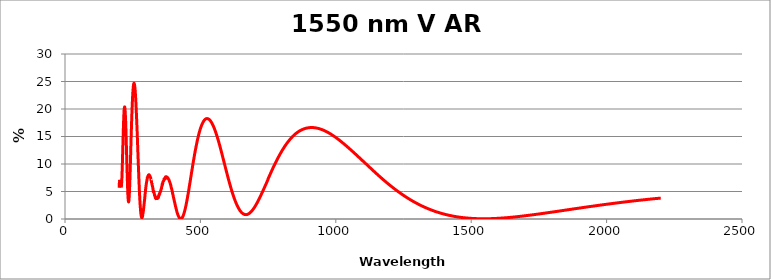
| Category | % Reflectance |
|---|---|
| 200.0 | 5.676 |
| 201.0 | 6.753 |
| 202.0 | 7.115 |
| 203.0 | 6.71 |
| 204.0 | 6.542 |
| 205.0 | 6.526 |
| 206.0 | 5.834 |
| 207.0 | 5.745 |
| 208.0 | 5.913 |
| 209.0 | 6.395 |
| 210.0 | 7.362 |
| 211.0 | 8.712 |
| 212.0 | 10.312 |
| 213.0 | 12.135 |
| 214.0 | 13.895 |
| 215.0 | 15.615 |
| 216.0 | 17.193 |
| 217.0 | 18.494 |
| 218.0 | 19.575 |
| 219.0 | 20.113 |
| 220.0 | 20.384 |
| 221.0 | 20.204 |
| 222.0 | 19.676 |
| 223.0 | 18.834 |
| 224.0 | 17.655 |
| 225.0 | 16.194 |
| 226.0 | 14.555 |
| 227.0 | 12.742 |
| 228.0 | 10.899 |
| 229.0 | 9.098 |
| 230.0 | 7.41 |
| 231.0 | 5.883 |
| 232.0 | 4.609 |
| 233.0 | 3.763 |
| 234.0 | 3.241 |
| 235.0 | 3.112 |
| 236.0 | 3.368 |
| 237.0 | 4.009 |
| 238.0 | 4.991 |
| 239.0 | 6.236 |
| 240.0 | 7.703 |
| 241.0 | 9.345 |
| 242.0 | 11.028 |
| 243.0 | 12.783 |
| 244.0 | 14.509 |
| 245.0 | 16.152 |
| 246.0 | 17.725 |
| 247.0 | 19.185 |
| 248.0 | 20.451 |
| 249.0 | 21.565 |
| 250.0 | 22.553 |
| 251.0 | 23.332 |
| 252.0 | 23.91 |
| 253.0 | 24.365 |
| 254.0 | 24.629 |
| 255.0 | 24.674 |
| 256.0 | 24.578 |
| 257.0 | 24.333 |
| 258.0 | 23.943 |
| 259.0 | 23.426 |
| 260.0 | 22.713 |
| 261.0 | 21.888 |
| 262.0 | 20.976 |
| 263.0 | 19.897 |
| 264.0 | 18.816 |
| 265.0 | 17.603 |
| 266.0 | 16.391 |
| 267.0 | 15.101 |
| 268.0 | 13.752 |
| 269.0 | 12.284 |
| 270.0 | 11 |
| 271.0 | 9.644 |
| 272.0 | 8.347 |
| 273.0 | 7.091 |
| 274.0 | 5.954 |
| 275.0 | 4.825 |
| 276.0 | 3.832 |
| 277.0 | 2.895 |
| 278.0 | 2.263 |
| 279.0 | 1.572 |
| 280.0 | 1.044 |
| 281.0 | 0.694 |
| 282.0 | 0.43 |
| 283.0 | 0.277 |
| 284.0 | 0.195 |
| 285.0 | 0.328 |
| 286.0 | 0.42 |
| 287.0 | 0.695 |
| 288.0 | 1.063 |
| 289.0 | 1.324 |
| 290.0 | 1.776 |
| 291.0 | 2.192 |
| 292.0 | 2.671 |
| 293.0 | 3.147 |
| 294.0 | 3.573 |
| 295.0 | 4.1 |
| 296.0 | 4.615 |
| 297.0 | 5.037 |
| 298.0 | 5.563 |
| 299.0 | 5.943 |
| 300.0 | 6.299 |
| 301.0 | 6.642 |
| 302.0 | 6.872 |
| 303.0 | 7.147 |
| 304.0 | 7.518 |
| 305.0 | 7.549 |
| 306.0 | 7.789 |
| 307.0 | 7.842 |
| 308.0 | 7.986 |
| 309.0 | 7.941 |
| 310.0 | 8.055 |
| 311.0 | 7.874 |
| 312.0 | 7.893 |
| 313.0 | 7.902 |
| 314.0 | 7.742 |
| 315.0 | 7.632 |
| 316.0 | 7.574 |
| 317.0 | 7.265 |
| 318.0 | 7.008 |
| 319.0 | 7.025 |
| 320.0 | 6.449 |
| 321.0 | 6.533 |
| 322.0 | 5.986 |
| 323.0 | 6.071 |
| 324.0 | 5.704 |
| 325.0 | 5.468 |
| 326.0 | 4.962 |
| 327.0 | 4.935 |
| 328.0 | 5.027 |
| 329.0 | 4.765 |
| 330.0 | 4.542 |
| 331.0 | 4.237 |
| 332.0 | 4.293 |
| 333.0 | 4.02 |
| 334.0 | 3.802 |
| 335.0 | 4.135 |
| 336.0 | 3.77 |
| 337.0 | 3.711 |
| 338.0 | 3.468 |
| 339.0 | 3.822 |
| 340.0 | 3.546 |
| 341.0 | 3.833 |
| 342.0 | 3.806 |
| 343.0 | 3.897 |
| 344.0 | 4.062 |
| 345.0 | 3.886 |
| 346.0 | 4.133 |
| 347.0 | 4.439 |
| 348.0 | 4.347 |
| 349.0 | 4.648 |
| 350.0 | 4.569 |
| 351.0 | 4.905 |
| 352.0 | 4.909 |
| 353.0 | 5.017 |
| 354.0 | 5.23 |
| 355.0 | 5.469 |
| 356.0 | 5.523 |
| 357.0 | 5.825 |
| 358.0 | 5.994 |
| 359.0 | 6.367 |
| 360.0 | 6.212 |
| 361.0 | 6.581 |
| 362.0 | 6.802 |
| 363.0 | 6.823 |
| 364.0 | 6.926 |
| 365.0 | 6.984 |
| 366.0 | 7.306 |
| 367.0 | 7.336 |
| 368.0 | 7.3 |
| 369.0 | 7.331 |
| 370.0 | 7.316 |
| 371.0 | 7.649 |
| 372.0 | 7.643 |
| 373.0 | 7.565 |
| 374.0 | 7.613 |
| 375.0 | 7.675 |
| 376.0 | 7.637 |
| 377.0 | 7.604 |
| 378.0 | 7.531 |
| 379.0 | 7.501 |
| 380.0 | 7.461 |
| 381.0 | 7.325 |
| 382.0 | 7.245 |
| 383.0 | 7.181 |
| 384.0 | 7.119 |
| 385.0 | 6.939 |
| 386.0 | 6.849 |
| 387.0 | 6.665 |
| 388.0 | 6.566 |
| 389.0 | 6.377 |
| 390.0 | 6.217 |
| 391.0 | 6.05 |
| 392.0 | 5.773 |
| 393.0 | 5.63 |
| 394.0 | 5.442 |
| 395.0 | 5.223 |
| 396.0 | 5.035 |
| 397.0 | 4.741 |
| 398.0 | 4.533 |
| 399.0 | 4.365 |
| 400.0 | 4.08 |
| 401.0 | 3.856 |
| 402.0 | 3.656 |
| 403.0 | 3.444 |
| 404.0 | 3.193 |
| 405.0 | 3.001 |
| 406.0 | 2.766 |
| 407.0 | 2.562 |
| 408.0 | 2.321 |
| 409.0 | 2.164 |
| 410.0 | 1.912 |
| 411.0 | 1.752 |
| 412.0 | 1.573 |
| 413.0 | 1.372 |
| 414.0 | 1.192 |
| 415.0 | 1.029 |
| 416.0 | 0.892 |
| 417.0 | 0.754 |
| 418.0 | 0.639 |
| 419.0 | 0.514 |
| 420.0 | 0.422 |
| 421.0 | 0.313 |
| 422.0 | 0.251 |
| 423.0 | 0.166 |
| 424.0 | 0.126 |
| 425.0 | 0.091 |
| 426.0 | 0.044 |
| 427.0 | 0.031 |
| 428.0 | 0.03 |
| 429.0 | 0.042 |
| 430.0 | 0.094 |
| 431.0 | 0.119 |
| 432.0 | 0.172 |
| 433.0 | 0.247 |
| 434.0 | 0.336 |
| 435.0 | 0.447 |
| 436.0 | 0.537 |
| 437.0 | 0.681 |
| 438.0 | 0.816 |
| 439.0 | 0.953 |
| 440.0 | 1.132 |
| 441.0 | 1.293 |
| 442.0 | 1.475 |
| 443.0 | 1.681 |
| 444.0 | 1.86 |
| 445.0 | 2.089 |
| 446.0 | 2.319 |
| 447.0 | 2.534 |
| 448.0 | 2.794 |
| 449.0 | 3.045 |
| 450.0 | 3.305 |
| 451.0 | 3.564 |
| 452.0 | 3.839 |
| 453.0 | 4.119 |
| 454.0 | 4.389 |
| 455.0 | 4.68 |
| 456.0 | 4.963 |
| 457.0 | 5.251 |
| 458.0 | 5.571 |
| 459.0 | 5.87 |
| 460.0 | 6.175 |
| 461.0 | 6.466 |
| 462.0 | 6.787 |
| 463.0 | 7.077 |
| 464.0 | 7.398 |
| 465.0 | 7.702 |
| 466.0 | 8.012 |
| 467.0 | 8.326 |
| 468.0 | 8.635 |
| 469.0 | 8.938 |
| 470.0 | 9.247 |
| 471.0 | 9.553 |
| 472.0 | 9.858 |
| 473.0 | 10.148 |
| 474.0 | 10.443 |
| 475.0 | 10.735 |
| 476.0 | 11.018 |
| 477.0 | 11.316 |
| 478.0 | 11.596 |
| 479.0 | 11.865 |
| 480.0 | 12.138 |
| 481.0 | 12.4 |
| 482.0 | 12.665 |
| 483.0 | 12.917 |
| 484.0 | 13.174 |
| 485.0 | 13.413 |
| 486.0 | 13.656 |
| 487.0 | 13.907 |
| 488.0 | 14.136 |
| 489.0 | 14.351 |
| 490.0 | 14.57 |
| 491.0 | 14.781 |
| 492.0 | 14.988 |
| 493.0 | 15.191 |
| 494.0 | 15.391 |
| 495.0 | 15.581 |
| 496.0 | 15.755 |
| 497.0 | 15.929 |
| 498.0 | 16.098 |
| 499.0 | 16.261 |
| 500.0 | 16.413 |
| 501.0 | 16.566 |
| 502.0 | 16.708 |
| 503.0 | 16.842 |
| 504.0 | 16.977 |
| 505.0 | 17.1 |
| 506.0 | 17.215 |
| 507.0 | 17.325 |
| 508.0 | 17.435 |
| 509.0 | 17.528 |
| 510.0 | 17.619 |
| 511.0 | 17.706 |
| 512.0 | 17.789 |
| 513.0 | 17.856 |
| 514.0 | 17.922 |
| 515.0 | 17.982 |
| 516.0 | 18.043 |
| 517.0 | 18.083 |
| 518.0 | 18.132 |
| 519.0 | 18.167 |
| 520.0 | 18.198 |
| 521.0 | 18.224 |
| 522.0 | 18.237 |
| 523.0 | 18.25 |
| 524.0 | 18.256 |
| 525.0 | 18.26 |
| 526.0 | 18.249 |
| 527.0 | 18.237 |
| 528.0 | 18.225 |
| 529.0 | 18.206 |
| 530.0 | 18.178 |
| 531.0 | 18.147 |
| 532.0 | 18.113 |
| 533.0 | 18.066 |
| 534.0 | 18.022 |
| 535.0 | 17.963 |
| 536.0 | 17.914 |
| 537.0 | 17.853 |
| 538.0 | 17.779 |
| 539.0 | 17.711 |
| 540.0 | 17.629 |
| 541.0 | 17.554 |
| 542.0 | 17.472 |
| 543.0 | 17.377 |
| 544.0 | 17.288 |
| 545.0 | 17.193 |
| 546.0 | 17.089 |
| 547.0 | 16.986 |
| 548.0 | 16.872 |
| 549.0 | 16.755 |
| 550.0 | 16.636 |
| 551.0 | 16.517 |
| 552.0 | 16.391 |
| 553.0 | 16.257 |
| 554.0 | 16.123 |
| 555.0 | 15.992 |
| 556.0 | 15.853 |
| 557.0 | 15.716 |
| 558.0 | 15.567 |
| 559.0 | 15.413 |
| 560.0 | 15.263 |
| 561.0 | 15.109 |
| 562.0 | 14.952 |
| 563.0 | 14.795 |
| 564.0 | 14.635 |
| 565.0 | 14.471 |
| 566.0 | 14.299 |
| 567.0 | 14.134 |
| 568.0 | 13.955 |
| 569.0 | 13.783 |
| 570.0 | 13.605 |
| 571.0 | 13.427 |
| 572.0 | 13.245 |
| 573.0 | 13.064 |
| 574.0 | 12.88 |
| 575.0 | 12.693 |
| 576.0 | 12.508 |
| 577.0 | 12.319 |
| 578.0 | 12.129 |
| 579.0 | 11.943 |
| 580.0 | 11.751 |
| 581.0 | 11.558 |
| 582.0 | 11.366 |
| 583.0 | 11.171 |
| 584.0 | 10.977 |
| 585.0 | 10.785 |
| 586.0 | 10.593 |
| 587.0 | 10.396 |
| 588.0 | 10.201 |
| 589.0 | 10.014 |
| 590.0 | 9.819 |
| 591.0 | 9.621 |
| 592.0 | 9.43 |
| 593.0 | 9.239 |
| 594.0 | 9.045 |
| 595.0 | 8.856 |
| 596.0 | 8.664 |
| 597.0 | 8.478 |
| 598.0 | 8.286 |
| 599.0 | 8.096 |
| 600.0 | 7.91 |
| 601.0 | 7.72 |
| 602.0 | 7.537 |
| 603.0 | 7.353 |
| 604.0 | 7.168 |
| 605.0 | 6.985 |
| 606.0 | 6.804 |
| 607.0 | 6.63 |
| 608.0 | 6.453 |
| 609.0 | 6.279 |
| 610.0 | 6.103 |
| 611.0 | 5.936 |
| 612.0 | 5.763 |
| 613.0 | 5.596 |
| 614.0 | 5.432 |
| 615.0 | 5.268 |
| 616.0 | 5.108 |
| 617.0 | 4.949 |
| 618.0 | 4.79 |
| 619.0 | 4.636 |
| 620.0 | 4.485 |
| 621.0 | 4.332 |
| 622.0 | 4.187 |
| 623.0 | 4.045 |
| 624.0 | 3.904 |
| 625.0 | 3.765 |
| 626.0 | 3.625 |
| 627.0 | 3.493 |
| 628.0 | 3.365 |
| 629.0 | 3.238 |
| 630.0 | 3.113 |
| 631.0 | 2.992 |
| 632.0 | 2.874 |
| 633.0 | 2.759 |
| 634.0 | 2.648 |
| 635.0 | 2.54 |
| 636.0 | 2.434 |
| 637.0 | 2.331 |
| 638.0 | 2.231 |
| 639.0 | 2.134 |
| 640.0 | 2.043 |
| 641.0 | 1.954 |
| 642.0 | 1.866 |
| 643.0 | 1.784 |
| 644.0 | 1.705 |
| 645.0 | 1.628 |
| 646.0 | 1.555 |
| 647.0 | 1.487 |
| 648.0 | 1.418 |
| 649.0 | 1.359 |
| 650.0 | 1.296 |
| 651.0 | 1.243 |
| 652.0 | 1.188 |
| 653.0 | 1.14 |
| 654.0 | 1.095 |
| 655.0 | 1.053 |
| 656.0 | 1.014 |
| 657.0 | 0.975 |
| 658.0 | 0.945 |
| 659.0 | 0.915 |
| 660.0 | 0.888 |
| 661.0 | 0.866 |
| 662.0 | 0.846 |
| 663.0 | 0.829 |
| 664.0 | 0.817 |
| 665.0 | 0.806 |
| 666.0 | 0.8 |
| 667.0 | 0.795 |
| 668.0 | 0.795 |
| 669.0 | 0.793 |
| 670.0 | 0.8 |
| 671.0 | 0.809 |
| 672.0 | 0.819 |
| 673.0 | 0.83 |
| 674.0 | 0.849 |
| 675.0 | 0.869 |
| 676.0 | 0.892 |
| 677.0 | 0.915 |
| 678.0 | 0.941 |
| 679.0 | 0.971 |
| 680.0 | 1.004 |
| 681.0 | 1.042 |
| 682.0 | 1.078 |
| 683.0 | 1.117 |
| 684.0 | 1.162 |
| 685.0 | 1.209 |
| 686.0 | 1.257 |
| 687.0 | 1.308 |
| 688.0 | 1.362 |
| 689.0 | 1.417 |
| 690.0 | 1.47 |
| 691.0 | 1.528 |
| 692.0 | 1.591 |
| 693.0 | 1.654 |
| 694.0 | 1.718 |
| 695.0 | 1.784 |
| 696.0 | 1.855 |
| 697.0 | 1.923 |
| 698.0 | 1.999 |
| 699.0 | 2.07 |
| 700.0 | 2.147 |
| 701.0 | 2.228 |
| 702.0 | 2.306 |
| 703.0 | 2.387 |
| 704.0 | 2.469 |
| 705.0 | 2.554 |
| 706.0 | 2.641 |
| 707.0 | 2.729 |
| 708.0 | 2.815 |
| 709.0 | 2.905 |
| 710.0 | 2.995 |
| 711.0 | 3.088 |
| 712.0 | 3.182 |
| 713.0 | 3.279 |
| 714.0 | 3.373 |
| 715.0 | 3.47 |
| 716.0 | 3.566 |
| 717.0 | 3.664 |
| 718.0 | 3.764 |
| 719.0 | 3.867 |
| 720.0 | 3.965 |
| 721.0 | 4.063 |
| 722.0 | 4.167 |
| 723.0 | 4.27 |
| 724.0 | 4.377 |
| 725.0 | 4.484 |
| 726.0 | 4.59 |
| 727.0 | 4.699 |
| 728.0 | 4.801 |
| 729.0 | 4.914 |
| 730.0 | 5.015 |
| 731.0 | 5.126 |
| 732.0 | 5.237 |
| 733.0 | 5.342 |
| 734.0 | 5.451 |
| 735.0 | 5.561 |
| 736.0 | 5.67 |
| 737.0 | 5.784 |
| 738.0 | 5.89 |
| 739.0 | 6.003 |
| 740.0 | 6.113 |
| 741.0 | 6.222 |
| 742.0 | 6.329 |
| 743.0 | 6.436 |
| 744.0 | 6.555 |
| 745.0 | 6.663 |
| 746.0 | 6.774 |
| 747.0 | 6.884 |
| 748.0 | 6.993 |
| 749.0 | 7.114 |
| 750.0 | 7.291 |
| 751.0 | 7.405 |
| 752.0 | 7.516 |
| 753.0 | 7.63 |
| 754.0 | 7.738 |
| 755.0 | 7.854 |
| 756.0 | 7.96 |
| 757.0 | 8.075 |
| 758.0 | 8.181 |
| 759.0 | 8.293 |
| 760.0 | 8.401 |
| 761.0 | 8.51 |
| 762.0 | 8.625 |
| 763.0 | 8.729 |
| 764.0 | 8.839 |
| 765.0 | 8.95 |
| 766.0 | 9.055 |
| 767.0 | 9.155 |
| 768.0 | 9.27 |
| 769.0 | 9.372 |
| 770.0 | 9.474 |
| 771.0 | 9.577 |
| 772.0 | 9.679 |
| 773.0 | 9.779 |
| 774.0 | 9.884 |
| 775.0 | 9.987 |
| 776.0 | 10.082 |
| 777.0 | 10.185 |
| 778.0 | 10.282 |
| 779.0 | 10.38 |
| 780.0 | 10.479 |
| 781.0 | 10.58 |
| 782.0 | 10.676 |
| 783.0 | 10.77 |
| 784.0 | 10.872 |
| 785.0 | 10.956 |
| 786.0 | 11.053 |
| 787.0 | 11.151 |
| 788.0 | 11.243 |
| 789.0 | 11.33 |
| 790.0 | 11.426 |
| 791.0 | 11.513 |
| 792.0 | 11.601 |
| 793.0 | 11.697 |
| 794.0 | 11.786 |
| 795.0 | 11.875 |
| 796.0 | 11.957 |
| 797.0 | 12.044 |
| 798.0 | 12.128 |
| 799.0 | 12.215 |
| 800.0 | 12.303 |
| 801.0 | 12.383 |
| 802.0 | 12.467 |
| 803.0 | 12.547 |
| 804.0 | 12.624 |
| 805.0 | 12.706 |
| 806.0 | 12.787 |
| 807.0 | 12.864 |
| 808.0 | 12.936 |
| 809.0 | 13.017 |
| 810.0 | 13.091 |
| 811.0 | 13.164 |
| 812.0 | 13.247 |
| 813.0 | 13.311 |
| 814.0 | 13.388 |
| 815.0 | 13.457 |
| 816.0 | 13.528 |
| 817.0 | 13.596 |
| 818.0 | 13.671 |
| 819.0 | 13.735 |
| 820.0 | 13.798 |
| 821.0 | 13.866 |
| 822.0 | 13.932 |
| 823.0 | 13.996 |
| 824.0 | 14.06 |
| 825.0 | 14.125 |
| 826.0 | 14.186 |
| 827.0 | 14.249 |
| 828.0 | 14.311 |
| 829.0 | 14.366 |
| 830.0 | 14.424 |
| 831.0 | 14.49 |
| 832.0 | 14.544 |
| 833.0 | 14.604 |
| 834.0 | 14.655 |
| 835.0 | 14.708 |
| 836.0 | 14.765 |
| 837.0 | 14.817 |
| 838.0 | 14.872 |
| 839.0 | 14.919 |
| 840.0 | 14.972 |
| 841.0 | 15.022 |
| 842.0 | 15.071 |
| 843.0 | 15.119 |
| 844.0 | 15.168 |
| 845.0 | 15.212 |
| 846.0 | 15.26 |
| 847.0 | 15.306 |
| 848.0 | 15.35 |
| 849.0 | 15.394 |
| 850.0 | 15.436 |
| 851.0 | 15.479 |
| 852.0 | 15.518 |
| 853.0 | 15.56 |
| 854.0 | 15.597 |
| 855.0 | 15.634 |
| 856.0 | 15.671 |
| 857.0 | 15.705 |
| 858.0 | 15.741 |
| 859.0 | 15.776 |
| 860.0 | 15.812 |
| 861.0 | 15.845 |
| 862.0 | 15.878 |
| 863.0 | 15.908 |
| 864.0 | 15.941 |
| 865.0 | 15.969 |
| 866.0 | 16.002 |
| 867.0 | 16.029 |
| 868.0 | 16.058 |
| 869.0 | 16.085 |
| 870.0 | 16.111 |
| 871.0 | 16.141 |
| 872.0 | 16.163 |
| 873.0 | 16.191 |
| 874.0 | 16.214 |
| 875.0 | 16.235 |
| 876.0 | 16.259 |
| 877.0 | 16.28 |
| 878.0 | 16.301 |
| 879.0 | 16.322 |
| 880.0 | 16.342 |
| 881.0 | 16.36 |
| 882.0 | 16.381 |
| 883.0 | 16.395 |
| 884.0 | 16.413 |
| 885.0 | 16.43 |
| 886.0 | 16.445 |
| 887.0 | 16.458 |
| 888.0 | 16.474 |
| 889.0 | 16.486 |
| 890.0 | 16.499 |
| 891.0 | 16.514 |
| 892.0 | 16.522 |
| 893.0 | 16.538 |
| 894.0 | 16.546 |
| 895.0 | 16.555 |
| 896.0 | 16.564 |
| 897.0 | 16.572 |
| 898.0 | 16.583 |
| 899.0 | 16.588 |
| 900.0 | 16.595 |
| 901.0 | 16.602 |
| 902.0 | 16.608 |
| 903.0 | 16.612 |
| 904.0 | 16.615 |
| 905.0 | 16.619 |
| 906.0 | 16.621 |
| 907.0 | 16.623 |
| 908.0 | 16.628 |
| 909.0 | 16.626 |
| 910.0 | 16.63 |
| 911.0 | 16.626 |
| 912.0 | 16.63 |
| 913.0 | 16.626 |
| 914.0 | 16.626 |
| 915.0 | 16.627 |
| 916.0 | 16.617 |
| 917.0 | 16.619 |
| 918.0 | 16.615 |
| 919.0 | 16.609 |
| 920.0 | 16.604 |
| 921.0 | 16.602 |
| 922.0 | 16.592 |
| 923.0 | 16.588 |
| 924.0 | 16.58 |
| 925.0 | 16.574 |
| 926.0 | 16.567 |
| 927.0 | 16.556 |
| 928.0 | 16.548 |
| 929.0 | 16.538 |
| 930.0 | 16.527 |
| 931.0 | 16.517 |
| 932.0 | 16.506 |
| 933.0 | 16.494 |
| 934.0 | 16.482 |
| 935.0 | 16.471 |
| 936.0 | 16.458 |
| 937.0 | 16.444 |
| 938.0 | 16.43 |
| 939.0 | 16.415 |
| 940.0 | 16.401 |
| 941.0 | 16.387 |
| 942.0 | 16.368 |
| 943.0 | 16.354 |
| 944.0 | 16.34 |
| 945.0 | 16.321 |
| 946.0 | 16.305 |
| 947.0 | 16.287 |
| 948.0 | 16.27 |
| 949.0 | 16.251 |
| 950.0 | 16.231 |
| 951.0 | 16.212 |
| 952.0 | 16.194 |
| 953.0 | 16.172 |
| 954.0 | 16.151 |
| 955.0 | 16.132 |
| 956.0 | 16.109 |
| 957.0 | 16.085 |
| 958.0 | 16.063 |
| 959.0 | 16.042 |
| 960.0 | 16.017 |
| 961.0 | 15.993 |
| 962.0 | 15.97 |
| 963.0 | 15.949 |
| 964.0 | 15.922 |
| 965.0 | 15.897 |
| 966.0 | 15.872 |
| 967.0 | 15.847 |
| 968.0 | 15.818 |
| 969.0 | 15.796 |
| 970.0 | 15.767 |
| 971.0 | 15.738 |
| 972.0 | 15.713 |
| 973.0 | 15.684 |
| 974.0 | 15.658 |
| 975.0 | 15.631 |
| 976.0 | 15.602 |
| 977.0 | 15.569 |
| 978.0 | 15.542 |
| 979.0 | 15.513 |
| 980.0 | 15.482 |
| 981.0 | 15.452 |
| 982.0 | 15.423 |
| 983.0 | 15.391 |
| 984.0 | 15.359 |
| 985.0 | 15.33 |
| 986.0 | 15.298 |
| 987.0 | 15.264 |
| 988.0 | 15.235 |
| 989.0 | 15.198 |
| 990.0 | 15.166 |
| 991.0 | 15.136 |
| 992.0 | 15.1 |
| 993.0 | 15.067 |
| 994.0 | 15.033 |
| 995.0 | 15 |
| 996.0 | 14.964 |
| 997.0 | 14.929 |
| 998.0 | 14.894 |
| 999.0 | 14.859 |
| 1000.0 | 14.825 |
| 1001.0 | 14.786 |
| 1002.0 | 14.751 |
| 1003.0 | 14.712 |
| 1004.0 | 14.676 |
| 1005.0 | 14.642 |
| 1006.0 | 14.603 |
| 1007.0 | 14.568 |
| 1008.0 | 14.527 |
| 1009.0 | 14.488 |
| 1010.0 | 14.453 |
| 1011.0 | 14.415 |
| 1012.0 | 14.378 |
| 1013.0 | 14.338 |
| 1014.0 | 14.301 |
| 1015.0 | 14.258 |
| 1016.0 | 14.221 |
| 1017.0 | 14.182 |
| 1018.0 | 14.141 |
| 1019.0 | 14.103 |
| 1020.0 | 14.065 |
| 1021.0 | 14.022 |
| 1022.0 | 13.982 |
| 1023.0 | 13.941 |
| 1024.0 | 13.901 |
| 1025.0 | 13.86 |
| 1026.0 | 13.821 |
| 1027.0 | 13.778 |
| 1028.0 | 13.739 |
| 1029.0 | 13.697 |
| 1030.0 | 13.657 |
| 1031.0 | 13.614 |
| 1032.0 | 13.575 |
| 1033.0 | 13.531 |
| 1034.0 | 13.489 |
| 1035.0 | 13.449 |
| 1036.0 | 13.408 |
| 1037.0 | 13.365 |
| 1038.0 | 13.323 |
| 1039.0 | 13.28 |
| 1040.0 | 13.236 |
| 1041.0 | 13.196 |
| 1042.0 | 13.154 |
| 1043.0 | 13.11 |
| 1044.0 | 13.066 |
| 1045.0 | 13.023 |
| 1046.0 | 12.981 |
| 1047.0 | 12.938 |
| 1048.0 | 12.893 |
| 1049.0 | 12.853 |
| 1050.0 | 12.807 |
| 1051.0 | 12.766 |
| 1052.0 | 12.718 |
| 1053.0 | 12.677 |
| 1054.0 | 12.633 |
| 1055.0 | 12.59 |
| 1056.0 | 12.545 |
| 1057.0 | 12.501 |
| 1058.0 | 12.457 |
| 1059.0 | 12.41 |
| 1060.0 | 12.365 |
| 1061.0 | 12.322 |
| 1062.0 | 12.278 |
| 1063.0 | 12.235 |
| 1064.0 | 12.188 |
| 1065.0 | 12.142 |
| 1066.0 | 12.099 |
| 1067.0 | 12.055 |
| 1068.0 | 12.009 |
| 1069.0 | 11.964 |
| 1070.0 | 11.922 |
| 1071.0 | 11.873 |
| 1072.0 | 11.829 |
| 1073.0 | 11.784 |
| 1074.0 | 11.739 |
| 1075.0 | 11.693 |
| 1076.0 | 11.647 |
| 1077.0 | 11.602 |
| 1078.0 | 11.555 |
| 1079.0 | 11.509 |
| 1080.0 | 11.466 |
| 1081.0 | 11.42 |
| 1082.0 | 11.373 |
| 1083.0 | 11.328 |
| 1084.0 | 11.281 |
| 1085.0 | 11.234 |
| 1086.0 | 11.19 |
| 1087.0 | 11.145 |
| 1088.0 | 11.098 |
| 1089.0 | 11.052 |
| 1090.0 | 11.004 |
| 1091.0 | 10.96 |
| 1092.0 | 10.912 |
| 1093.0 | 10.867 |
| 1094.0 | 10.82 |
| 1095.0 | 10.775 |
| 1096.0 | 10.728 |
| 1097.0 | 10.682 |
| 1098.0 | 10.633 |
| 1099.0 | 10.586 |
| 1100.0 | 10.564 |
| 1101.0 | 10.519 |
| 1102.0 | 10.472 |
| 1103.0 | 10.425 |
| 1104.0 | 10.377 |
| 1105.0 | 10.329 |
| 1106.0 | 10.282 |
| 1107.0 | 10.237 |
| 1108.0 | 10.192 |
| 1109.0 | 10.143 |
| 1110.0 | 10.094 |
| 1111.0 | 10.048 |
| 1112.0 | 10.003 |
| 1113.0 | 9.956 |
| 1114.0 | 9.913 |
| 1115.0 | 9.864 |
| 1116.0 | 9.816 |
| 1117.0 | 9.771 |
| 1118.0 | 9.725 |
| 1119.0 | 9.68 |
| 1120.0 | 9.634 |
| 1121.0 | 9.586 |
| 1122.0 | 9.541 |
| 1123.0 | 9.492 |
| 1124.0 | 9.447 |
| 1125.0 | 9.4 |
| 1126.0 | 9.353 |
| 1127.0 | 9.308 |
| 1128.0 | 9.264 |
| 1129.0 | 9.213 |
| 1130.0 | 9.169 |
| 1131.0 | 9.122 |
| 1132.0 | 9.076 |
| 1133.0 | 9.032 |
| 1134.0 | 8.983 |
| 1135.0 | 8.937 |
| 1136.0 | 8.892 |
| 1137.0 | 8.847 |
| 1138.0 | 8.8 |
| 1139.0 | 8.757 |
| 1140.0 | 8.709 |
| 1141.0 | 8.662 |
| 1142.0 | 8.618 |
| 1143.0 | 8.573 |
| 1144.0 | 8.531 |
| 1145.0 | 8.484 |
| 1146.0 | 8.44 |
| 1147.0 | 8.393 |
| 1148.0 | 8.348 |
| 1149.0 | 8.303 |
| 1150.0 | 8.258 |
| 1151.0 | 8.214 |
| 1152.0 | 8.169 |
| 1153.0 | 8.124 |
| 1154.0 | 8.079 |
| 1155.0 | 8.034 |
| 1156.0 | 7.99 |
| 1157.0 | 7.947 |
| 1158.0 | 7.904 |
| 1159.0 | 7.859 |
| 1160.0 | 7.815 |
| 1161.0 | 7.77 |
| 1162.0 | 7.727 |
| 1163.0 | 7.683 |
| 1164.0 | 7.64 |
| 1165.0 | 7.595 |
| 1166.0 | 7.553 |
| 1167.0 | 7.506 |
| 1168.0 | 7.465 |
| 1169.0 | 7.423 |
| 1170.0 | 7.378 |
| 1171.0 | 7.337 |
| 1172.0 | 7.294 |
| 1173.0 | 7.248 |
| 1174.0 | 7.206 |
| 1175.0 | 7.163 |
| 1176.0 | 7.121 |
| 1177.0 | 7.079 |
| 1178.0 | 7.036 |
| 1179.0 | 6.993 |
| 1180.0 | 6.949 |
| 1181.0 | 6.909 |
| 1182.0 | 6.867 |
| 1183.0 | 6.826 |
| 1184.0 | 6.783 |
| 1185.0 | 6.741 |
| 1186.0 | 6.699 |
| 1187.0 | 6.659 |
| 1188.0 | 6.617 |
| 1189.0 | 6.575 |
| 1190.0 | 6.535 |
| 1191.0 | 6.492 |
| 1192.0 | 6.45 |
| 1193.0 | 6.41 |
| 1194.0 | 6.368 |
| 1195.0 | 6.328 |
| 1196.0 | 6.288 |
| 1197.0 | 6.249 |
| 1198.0 | 6.206 |
| 1199.0 | 6.166 |
| 1200.0 | 6.129 |
| 1201.0 | 6.089 |
| 1202.0 | 6.051 |
| 1203.0 | 6.012 |
| 1204.0 | 5.975 |
| 1205.0 | 5.931 |
| 1206.0 | 5.894 |
| 1207.0 | 5.857 |
| 1208.0 | 5.817 |
| 1209.0 | 5.779 |
| 1210.0 | 5.74 |
| 1211.0 | 5.7 |
| 1212.0 | 5.662 |
| 1213.0 | 5.625 |
| 1214.0 | 5.586 |
| 1215.0 | 5.548 |
| 1216.0 | 5.511 |
| 1217.0 | 5.471 |
| 1218.0 | 5.435 |
| 1219.0 | 5.399 |
| 1220.0 | 5.361 |
| 1221.0 | 5.324 |
| 1222.0 | 5.288 |
| 1223.0 | 5.248 |
| 1224.0 | 5.213 |
| 1225.0 | 5.177 |
| 1226.0 | 5.139 |
| 1227.0 | 5.101 |
| 1228.0 | 5.067 |
| 1229.0 | 5.029 |
| 1230.0 | 4.993 |
| 1231.0 | 4.957 |
| 1232.0 | 4.923 |
| 1233.0 | 4.886 |
| 1234.0 | 4.851 |
| 1235.0 | 4.815 |
| 1236.0 | 4.78 |
| 1237.0 | 4.746 |
| 1238.0 | 4.709 |
| 1239.0 | 4.676 |
| 1240.0 | 4.641 |
| 1241.0 | 4.607 |
| 1242.0 | 4.572 |
| 1243.0 | 4.538 |
| 1244.0 | 4.503 |
| 1245.0 | 4.469 |
| 1246.0 | 4.435 |
| 1247.0 | 4.403 |
| 1248.0 | 4.368 |
| 1249.0 | 4.333 |
| 1250.0 | 4.302 |
| 1251.0 | 4.268 |
| 1252.0 | 4.235 |
| 1253.0 | 4.202 |
| 1254.0 | 4.169 |
| 1255.0 | 4.136 |
| 1256.0 | 4.104 |
| 1257.0 | 4.071 |
| 1258.0 | 4.038 |
| 1259.0 | 4.007 |
| 1260.0 | 3.976 |
| 1261.0 | 3.943 |
| 1262.0 | 3.911 |
| 1263.0 | 3.881 |
| 1264.0 | 3.849 |
| 1265.0 | 3.817 |
| 1266.0 | 3.786 |
| 1267.0 | 3.757 |
| 1268.0 | 3.724 |
| 1269.0 | 3.694 |
| 1270.0 | 3.663 |
| 1271.0 | 3.634 |
| 1272.0 | 3.603 |
| 1273.0 | 3.574 |
| 1274.0 | 3.543 |
| 1275.0 | 3.513 |
| 1276.0 | 3.484 |
| 1277.0 | 3.453 |
| 1278.0 | 3.424 |
| 1279.0 | 3.397 |
| 1280.0 | 3.367 |
| 1281.0 | 3.337 |
| 1282.0 | 3.309 |
| 1283.0 | 3.281 |
| 1284.0 | 3.252 |
| 1285.0 | 3.224 |
| 1286.0 | 3.196 |
| 1287.0 | 3.166 |
| 1288.0 | 3.141 |
| 1289.0 | 3.113 |
| 1290.0 | 3.085 |
| 1291.0 | 3.059 |
| 1292.0 | 3.032 |
| 1293.0 | 3.005 |
| 1294.0 | 2.977 |
| 1295.0 | 2.952 |
| 1296.0 | 2.924 |
| 1297.0 | 2.898 |
| 1298.0 | 2.872 |
| 1299.0 | 2.845 |
| 1300.0 | 2.819 |
| 1301.0 | 2.793 |
| 1302.0 | 2.768 |
| 1303.0 | 2.742 |
| 1304.0 | 2.716 |
| 1305.0 | 2.691 |
| 1306.0 | 2.663 |
| 1307.0 | 2.639 |
| 1308.0 | 2.615 |
| 1309.0 | 2.591 |
| 1310.0 | 2.565 |
| 1311.0 | 2.54 |
| 1312.0 | 2.515 |
| 1313.0 | 2.491 |
| 1314.0 | 2.468 |
| 1315.0 | 2.444 |
| 1316.0 | 2.419 |
| 1317.0 | 2.395 |
| 1318.0 | 2.37 |
| 1319.0 | 2.348 |
| 1320.0 | 2.325 |
| 1321.0 | 2.301 |
| 1322.0 | 2.279 |
| 1323.0 | 2.257 |
| 1324.0 | 2.234 |
| 1325.0 | 2.211 |
| 1326.0 | 2.189 |
| 1327.0 | 2.167 |
| 1328.0 | 2.143 |
| 1329.0 | 2.122 |
| 1330.0 | 2.1 |
| 1331.0 | 2.078 |
| 1332.0 | 2.057 |
| 1333.0 | 2.036 |
| 1334.0 | 2.013 |
| 1335.0 | 1.991 |
| 1336.0 | 1.971 |
| 1337.0 | 1.95 |
| 1338.0 | 1.929 |
| 1339.0 | 1.909 |
| 1340.0 | 1.888 |
| 1341.0 | 1.868 |
| 1342.0 | 1.847 |
| 1343.0 | 1.826 |
| 1344.0 | 1.807 |
| 1345.0 | 1.787 |
| 1346.0 | 1.768 |
| 1347.0 | 1.748 |
| 1348.0 | 1.729 |
| 1349.0 | 1.711 |
| 1350.0 | 1.691 |
| 1351.0 | 1.672 |
| 1352.0 | 1.653 |
| 1353.0 | 1.634 |
| 1354.0 | 1.616 |
| 1355.0 | 1.598 |
| 1356.0 | 1.579 |
| 1357.0 | 1.559 |
| 1358.0 | 1.542 |
| 1359.0 | 1.523 |
| 1360.0 | 1.506 |
| 1361.0 | 1.487 |
| 1362.0 | 1.468 |
| 1363.0 | 1.449 |
| 1364.0 | 1.43 |
| 1365.0 | 1.414 |
| 1366.0 | 1.395 |
| 1367.0 | 1.378 |
| 1368.0 | 1.362 |
| 1369.0 | 1.344 |
| 1370.0 | 1.327 |
| 1371.0 | 1.313 |
| 1372.0 | 1.296 |
| 1373.0 | 1.279 |
| 1374.0 | 1.267 |
| 1375.0 | 1.251 |
| 1376.0 | 1.235 |
| 1377.0 | 1.22 |
| 1378.0 | 1.205 |
| 1379.0 | 1.189 |
| 1380.0 | 1.175 |
| 1381.0 | 1.158 |
| 1382.0 | 1.141 |
| 1383.0 | 1.126 |
| 1384.0 | 1.11 |
| 1385.0 | 1.095 |
| 1386.0 | 1.079 |
| 1387.0 | 1.066 |
| 1388.0 | 1.051 |
| 1389.0 | 1.038 |
| 1390.0 | 1.024 |
| 1391.0 | 1.01 |
| 1392.0 | 0.997 |
| 1393.0 | 0.983 |
| 1394.0 | 0.97 |
| 1395.0 | 0.955 |
| 1396.0 | 0.943 |
| 1397.0 | 0.928 |
| 1398.0 | 0.916 |
| 1399.0 | 0.903 |
| 1400.0 | 0.889 |
| 1401.0 | 0.876 |
| 1402.0 | 0.863 |
| 1403.0 | 0.851 |
| 1404.0 | 0.838 |
| 1405.0 | 0.825 |
| 1406.0 | 0.813 |
| 1407.0 | 0.801 |
| 1408.0 | 0.789 |
| 1409.0 | 0.777 |
| 1410.0 | 0.765 |
| 1411.0 | 0.755 |
| 1412.0 | 0.742 |
| 1413.0 | 0.731 |
| 1414.0 | 0.72 |
| 1415.0 | 0.708 |
| 1416.0 | 0.697 |
| 1417.0 | 0.687 |
| 1418.0 | 0.677 |
| 1419.0 | 0.665 |
| 1420.0 | 0.655 |
| 1421.0 | 0.643 |
| 1422.0 | 0.633 |
| 1423.0 | 0.624 |
| 1424.0 | 0.613 |
| 1425.0 | 0.604 |
| 1426.0 | 0.593 |
| 1427.0 | 0.583 |
| 1428.0 | 0.573 |
| 1429.0 | 0.564 |
| 1430.0 | 0.554 |
| 1431.0 | 0.545 |
| 1432.0 | 0.534 |
| 1433.0 | 0.524 |
| 1434.0 | 0.515 |
| 1435.0 | 0.506 |
| 1436.0 | 0.497 |
| 1437.0 | 0.488 |
| 1438.0 | 0.48 |
| 1439.0 | 0.47 |
| 1440.0 | 0.462 |
| 1441.0 | 0.454 |
| 1442.0 | 0.445 |
| 1443.0 | 0.436 |
| 1444.0 | 0.429 |
| 1445.0 | 0.419 |
| 1446.0 | 0.413 |
| 1447.0 | 0.403 |
| 1448.0 | 0.395 |
| 1449.0 | 0.387 |
| 1450.0 | 0.381 |
| 1451.0 | 0.373 |
| 1452.0 | 0.366 |
| 1453.0 | 0.358 |
| 1454.0 | 0.351 |
| 1455.0 | 0.344 |
| 1456.0 | 0.338 |
| 1457.0 | 0.33 |
| 1458.0 | 0.322 |
| 1459.0 | 0.317 |
| 1460.0 | 0.31 |
| 1461.0 | 0.304 |
| 1462.0 | 0.298 |
| 1463.0 | 0.29 |
| 1464.0 | 0.285 |
| 1465.0 | 0.277 |
| 1466.0 | 0.271 |
| 1467.0 | 0.266 |
| 1468.0 | 0.261 |
| 1469.0 | 0.255 |
| 1470.0 | 0.249 |
| 1471.0 | 0.243 |
| 1472.0 | 0.237 |
| 1473.0 | 0.231 |
| 1474.0 | 0.227 |
| 1475.0 | 0.221 |
| 1476.0 | 0.216 |
| 1477.0 | 0.21 |
| 1478.0 | 0.206 |
| 1479.0 | 0.202 |
| 1480.0 | 0.196 |
| 1481.0 | 0.191 |
| 1482.0 | 0.187 |
| 1483.0 | 0.182 |
| 1484.0 | 0.178 |
| 1485.0 | 0.174 |
| 1486.0 | 0.167 |
| 1487.0 | 0.164 |
| 1488.0 | 0.161 |
| 1489.0 | 0.156 |
| 1490.0 | 0.151 |
| 1491.0 | 0.149 |
| 1492.0 | 0.145 |
| 1493.0 | 0.141 |
| 1494.0 | 0.137 |
| 1495.0 | 0.133 |
| 1496.0 | 0.128 |
| 1497.0 | 0.125 |
| 1498.0 | 0.123 |
| 1499.0 | 0.119 |
| 1500.0 | 0.116 |
| 1501.0 | 0.113 |
| 1502.0 | 0.11 |
| 1503.0 | 0.107 |
| 1504.0 | 0.104 |
| 1505.0 | 0.102 |
| 1506.0 | 0.099 |
| 1507.0 | 0.096 |
| 1508.0 | 0.093 |
| 1509.0 | 0.09 |
| 1510.0 | 0.088 |
| 1511.0 | 0.086 |
| 1512.0 | 0.083 |
| 1513.0 | 0.081 |
| 1514.0 | 0.079 |
| 1515.0 | 0.077 |
| 1516.0 | 0.076 |
| 1517.0 | 0.073 |
| 1518.0 | 0.072 |
| 1519.0 | 0.069 |
| 1520.0 | 0.067 |
| 1521.0 | 0.067 |
| 1522.0 | 0.064 |
| 1523.0 | 0.063 |
| 1524.0 | 0.061 |
| 1525.0 | 0.06 |
| 1526.0 | 0.059 |
| 1527.0 | 0.057 |
| 1528.0 | 0.056 |
| 1529.0 | 0.055 |
| 1530.0 | 0.055 |
| 1531.0 | 0.054 |
| 1532.0 | 0.053 |
| 1533.0 | 0.051 |
| 1534.0 | 0.051 |
| 1535.0 | 0.05 |
| 1536.0 | 0.049 |
| 1537.0 | 0.049 |
| 1538.0 | 0.049 |
| 1539.0 | 0.048 |
| 1540.0 | 0.048 |
| 1541.0 | 0.047 |
| 1542.0 | 0.048 |
| 1543.0 | 0.046 |
| 1544.0 | 0.046 |
| 1545.0 | 0.046 |
| 1546.0 | 0.048 |
| 1547.0 | 0.046 |
| 1548.0 | 0.047 |
| 1549.0 | 0.047 |
| 1550.0 | 0.047 |
| 1551.0 | 0.048 |
| 1552.0 | 0.048 |
| 1553.0 | 0.048 |
| 1554.0 | 0.048 |
| 1555.0 | 0.048 |
| 1556.0 | 0.05 |
| 1557.0 | 0.049 |
| 1558.0 | 0.051 |
| 1559.0 | 0.052 |
| 1560.0 | 0.053 |
| 1561.0 | 0.054 |
| 1562.0 | 0.055 |
| 1563.0 | 0.056 |
| 1564.0 | 0.057 |
| 1565.0 | 0.058 |
| 1566.0 | 0.06 |
| 1567.0 | 0.059 |
| 1568.0 | 0.061 |
| 1569.0 | 0.062 |
| 1570.0 | 0.063 |
| 1571.0 | 0.065 |
| 1572.0 | 0.067 |
| 1573.0 | 0.068 |
| 1574.0 | 0.068 |
| 1575.0 | 0.072 |
| 1576.0 | 0.073 |
| 1577.0 | 0.075 |
| 1578.0 | 0.077 |
| 1579.0 | 0.077 |
| 1580.0 | 0.081 |
| 1581.0 | 0.082 |
| 1582.0 | 0.085 |
| 1583.0 | 0.086 |
| 1584.0 | 0.089 |
| 1585.0 | 0.091 |
| 1586.0 | 0.092 |
| 1587.0 | 0.095 |
| 1588.0 | 0.097 |
| 1589.0 | 0.099 |
| 1590.0 | 0.102 |
| 1591.0 | 0.105 |
| 1592.0 | 0.107 |
| 1593.0 | 0.109 |
| 1594.0 | 0.112 |
| 1595.0 | 0.114 |
| 1596.0 | 0.117 |
| 1597.0 | 0.119 |
| 1598.0 | 0.123 |
| 1599.0 | 0.125 |
| 1600.0 | 0.129 |
| 1601.0 | 0.131 |
| 1602.0 | 0.135 |
| 1603.0 | 0.137 |
| 1604.0 | 0.139 |
| 1605.0 | 0.143 |
| 1606.0 | 0.147 |
| 1607.0 | 0.149 |
| 1608.0 | 0.152 |
| 1609.0 | 0.157 |
| 1610.0 | 0.16 |
| 1611.0 | 0.162 |
| 1612.0 | 0.166 |
| 1613.0 | 0.169 |
| 1614.0 | 0.173 |
| 1615.0 | 0.176 |
| 1616.0 | 0.18 |
| 1617.0 | 0.183 |
| 1618.0 | 0.187 |
| 1619.0 | 0.191 |
| 1620.0 | 0.195 |
| 1621.0 | 0.198 |
| 1622.0 | 0.202 |
| 1623.0 | 0.206 |
| 1624.0 | 0.21 |
| 1625.0 | 0.213 |
| 1626.0 | 0.218 |
| 1627.0 | 0.221 |
| 1628.0 | 0.225 |
| 1629.0 | 0.23 |
| 1630.0 | 0.233 |
| 1631.0 | 0.238 |
| 1632.0 | 0.241 |
| 1633.0 | 0.245 |
| 1634.0 | 0.25 |
| 1635.0 | 0.254 |
| 1636.0 | 0.259 |
| 1637.0 | 0.262 |
| 1638.0 | 0.267 |
| 1639.0 | 0.271 |
| 1640.0 | 0.275 |
| 1641.0 | 0.28 |
| 1642.0 | 0.284 |
| 1643.0 | 0.288 |
| 1644.0 | 0.294 |
| 1645.0 | 0.299 |
| 1646.0 | 0.303 |
| 1647.0 | 0.308 |
| 1648.0 | 0.313 |
| 1649.0 | 0.316 |
| 1650.0 | 0.322 |
| 1651.0 | 0.327 |
| 1652.0 | 0.331 |
| 1653.0 | 0.336 |
| 1654.0 | 0.341 |
| 1655.0 | 0.345 |
| 1656.0 | 0.351 |
| 1657.0 | 0.355 |
| 1658.0 | 0.36 |
| 1659.0 | 0.365 |
| 1660.0 | 0.371 |
| 1661.0 | 0.375 |
| 1662.0 | 0.381 |
| 1663.0 | 0.385 |
| 1664.0 | 0.391 |
| 1665.0 | 0.396 |
| 1666.0 | 0.4 |
| 1667.0 | 0.406 |
| 1668.0 | 0.411 |
| 1669.0 | 0.416 |
| 1670.0 | 0.423 |
| 1671.0 | 0.427 |
| 1672.0 | 0.433 |
| 1673.0 | 0.438 |
| 1674.0 | 0.444 |
| 1675.0 | 0.45 |
| 1676.0 | 0.454 |
| 1677.0 | 0.461 |
| 1678.0 | 0.465 |
| 1679.0 | 0.472 |
| 1680.0 | 0.477 |
| 1681.0 | 0.483 |
| 1682.0 | 0.487 |
| 1683.0 | 0.493 |
| 1684.0 | 0.499 |
| 1685.0 | 0.504 |
| 1686.0 | 0.512 |
| 1687.0 | 0.517 |
| 1688.0 | 0.522 |
| 1689.0 | 0.529 |
| 1690.0 | 0.534 |
| 1691.0 | 0.54 |
| 1692.0 | 0.546 |
| 1693.0 | 0.552 |
| 1694.0 | 0.558 |
| 1695.0 | 0.565 |
| 1696.0 | 0.57 |
| 1697.0 | 0.576 |
| 1698.0 | 0.582 |
| 1699.0 | 0.587 |
| 1700.0 | 0.595 |
| 1701.0 | 0.6 |
| 1702.0 | 0.607 |
| 1703.0 | 0.612 |
| 1704.0 | 0.619 |
| 1705.0 | 0.625 |
| 1706.0 | 0.631 |
| 1707.0 | 0.636 |
| 1708.0 | 0.644 |
| 1709.0 | 0.649 |
| 1710.0 | 0.655 |
| 1711.0 | 0.662 |
| 1712.0 | 0.669 |
| 1713.0 | 0.674 |
| 1714.0 | 0.679 |
| 1715.0 | 0.686 |
| 1716.0 | 0.692 |
| 1717.0 | 0.699 |
| 1718.0 | 0.705 |
| 1719.0 | 0.711 |
| 1720.0 | 0.718 |
| 1721.0 | 0.725 |
| 1722.0 | 0.731 |
| 1723.0 | 0.736 |
| 1724.0 | 0.743 |
| 1725.0 | 0.749 |
| 1726.0 | 0.756 |
| 1727.0 | 0.763 |
| 1728.0 | 0.769 |
| 1729.0 | 0.776 |
| 1730.0 | 0.783 |
| 1731.0 | 0.788 |
| 1732.0 | 0.795 |
| 1733.0 | 0.802 |
| 1734.0 | 0.808 |
| 1735.0 | 0.816 |
| 1736.0 | 0.822 |
| 1737.0 | 0.828 |
| 1738.0 | 0.835 |
| 1739.0 | 0.842 |
| 1740.0 | 0.848 |
| 1741.0 | 0.855 |
| 1742.0 | 0.861 |
| 1743.0 | 0.868 |
| 1744.0 | 0.875 |
| 1745.0 | 0.882 |
| 1746.0 | 0.888 |
| 1747.0 | 0.895 |
| 1748.0 | 0.901 |
| 1749.0 | 0.908 |
| 1750.0 | 0.915 |
| 1751.0 | 0.922 |
| 1752.0 | 0.929 |
| 1753.0 | 0.936 |
| 1754.0 | 0.943 |
| 1755.0 | 0.949 |
| 1756.0 | 0.956 |
| 1757.0 | 0.963 |
| 1758.0 | 0.969 |
| 1759.0 | 0.977 |
| 1760.0 | 0.982 |
| 1761.0 | 0.989 |
| 1762.0 | 0.997 |
| 1763.0 | 1.003 |
| 1764.0 | 1.011 |
| 1765.0 | 1.018 |
| 1766.0 | 1.025 |
| 1767.0 | 1.031 |
| 1768.0 | 1.038 |
| 1769.0 | 1.046 |
| 1770.0 | 1.052 |
| 1771.0 | 1.059 |
| 1772.0 | 1.067 |
| 1773.0 | 1.074 |
| 1774.0 | 1.08 |
| 1775.0 | 1.087 |
| 1776.0 | 1.093 |
| 1777.0 | 1.102 |
| 1778.0 | 1.109 |
| 1779.0 | 1.115 |
| 1780.0 | 1.123 |
| 1781.0 | 1.13 |
| 1782.0 | 1.137 |
| 1783.0 | 1.144 |
| 1784.0 | 1.151 |
| 1785.0 | 1.158 |
| 1786.0 | 1.165 |
| 1787.0 | 1.172 |
| 1788.0 | 1.178 |
| 1789.0 | 1.187 |
| 1790.0 | 1.194 |
| 1791.0 | 1.201 |
| 1792.0 | 1.208 |
| 1793.0 | 1.215 |
| 1794.0 | 1.222 |
| 1795.0 | 1.23 |
| 1796.0 | 1.236 |
| 1797.0 | 1.243 |
| 1798.0 | 1.25 |
| 1799.0 | 1.257 |
| 1800.0 | 1.264 |
| 1801.0 | 1.272 |
| 1802.0 | 1.278 |
| 1803.0 | 1.286 |
| 1804.0 | 1.294 |
| 1805.0 | 1.3 |
| 1806.0 | 1.308 |
| 1807.0 | 1.314 |
| 1808.0 | 1.322 |
| 1809.0 | 1.327 |
| 1810.0 | 1.335 |
| 1811.0 | 1.342 |
| 1812.0 | 1.349 |
| 1813.0 | 1.356 |
| 1814.0 | 1.364 |
| 1815.0 | 1.372 |
| 1816.0 | 1.379 |
| 1817.0 | 1.386 |
| 1818.0 | 1.394 |
| 1819.0 | 1.4 |
| 1820.0 | 1.407 |
| 1821.0 | 1.414 |
| 1822.0 | 1.422 |
| 1823.0 | 1.43 |
| 1824.0 | 1.437 |
| 1825.0 | 1.444 |
| 1826.0 | 1.451 |
| 1827.0 | 1.458 |
| 1828.0 | 1.465 |
| 1829.0 | 1.471 |
| 1830.0 | 1.478 |
| 1831.0 | 1.488 |
| 1832.0 | 1.493 |
| 1833.0 | 1.5 |
| 1834.0 | 1.508 |
| 1835.0 | 1.516 |
| 1836.0 | 1.522 |
| 1837.0 | 1.531 |
| 1838.0 | 1.538 |
| 1839.0 | 1.545 |
| 1840.0 | 1.553 |
| 1841.0 | 1.561 |
| 1842.0 | 1.568 |
| 1843.0 | 1.575 |
| 1844.0 | 1.583 |
| 1845.0 | 1.591 |
| 1846.0 | 1.598 |
| 1847.0 | 1.604 |
| 1848.0 | 1.613 |
| 1849.0 | 1.618 |
| 1850.0 | 1.627 |
| 1851.0 | 1.634 |
| 1852.0 | 1.642 |
| 1853.0 | 1.648 |
| 1854.0 | 1.655 |
| 1855.0 | 1.662 |
| 1856.0 | 1.669 |
| 1857.0 | 1.677 |
| 1858.0 | 1.684 |
| 1859.0 | 1.692 |
| 1860.0 | 1.698 |
| 1861.0 | 1.704 |
| 1862.0 | 1.711 |
| 1863.0 | 1.717 |
| 1864.0 | 1.725 |
| 1865.0 | 1.732 |
| 1866.0 | 1.74 |
| 1867.0 | 1.747 |
| 1868.0 | 1.756 |
| 1869.0 | 1.763 |
| 1870.0 | 1.771 |
| 1871.0 | 1.778 |
| 1872.0 | 1.787 |
| 1873.0 | 1.796 |
| 1874.0 | 1.802 |
| 1875.0 | 1.81 |
| 1876.0 | 1.818 |
| 1877.0 | 1.826 |
| 1878.0 | 1.833 |
| 1879.0 | 1.842 |
| 1880.0 | 1.846 |
| 1881.0 | 1.854 |
| 1882.0 | 1.86 |
| 1883.0 | 1.868 |
| 1884.0 | 1.875 |
| 1885.0 | 1.883 |
| 1886.0 | 1.887 |
| 1887.0 | 1.895 |
| 1888.0 | 1.901 |
| 1889.0 | 1.909 |
| 1890.0 | 1.915 |
| 1891.0 | 1.923 |
| 1892.0 | 1.929 |
| 1893.0 | 1.937 |
| 1894.0 | 1.943 |
| 1895.0 | 1.952 |
| 1896.0 | 1.958 |
| 1897.0 | 1.966 |
| 1898.0 | 1.972 |
| 1899.0 | 1.981 |
| 1900.0 | 1.988 |
| 1901.0 | 1.995 |
| 1902.0 | 2.003 |
| 1903.0 | 2.01 |
| 1904.0 | 2.017 |
| 1905.0 | 2.024 |
| 1906.0 | 2.033 |
| 1907.0 | 2.04 |
| 1908.0 | 2.048 |
| 1909.0 | 2.055 |
| 1910.0 | 2.062 |
| 1911.0 | 2.069 |
| 1912.0 | 2.077 |
| 1913.0 | 2.084 |
| 1914.0 | 2.091 |
| 1915.0 | 2.097 |
| 1916.0 | 2.104 |
| 1917.0 | 2.112 |
| 1918.0 | 2.119 |
| 1919.0 | 2.126 |
| 1920.0 | 2.133 |
| 1921.0 | 2.14 |
| 1922.0 | 2.148 |
| 1923.0 | 2.154 |
| 1924.0 | 2.16 |
| 1925.0 | 2.168 |
| 1926.0 | 2.176 |
| 1927.0 | 2.182 |
| 1928.0 | 2.189 |
| 1929.0 | 2.195 |
| 1930.0 | 2.203 |
| 1931.0 | 2.21 |
| 1932.0 | 2.217 |
| 1933.0 | 2.224 |
| 1934.0 | 2.231 |
| 1935.0 | 2.237 |
| 1936.0 | 2.245 |
| 1937.0 | 2.251 |
| 1938.0 | 2.258 |
| 1939.0 | 2.266 |
| 1940.0 | 2.272 |
| 1941.0 | 2.28 |
| 1942.0 | 2.286 |
| 1943.0 | 2.292 |
| 1944.0 | 2.3 |
| 1945.0 | 2.307 |
| 1946.0 | 2.313 |
| 1947.0 | 2.32 |
| 1948.0 | 2.327 |
| 1949.0 | 2.334 |
| 1950.0 | 2.341 |
| 1951.0 | 2.348 |
| 1952.0 | 2.355 |
| 1953.0 | 2.362 |
| 1954.0 | 2.369 |
| 1955.0 | 2.375 |
| 1956.0 | 2.382 |
| 1957.0 | 2.389 |
| 1958.0 | 2.397 |
| 1959.0 | 2.403 |
| 1960.0 | 2.409 |
| 1961.0 | 2.417 |
| 1962.0 | 2.423 |
| 1963.0 | 2.431 |
| 1964.0 | 2.438 |
| 1965.0 | 2.444 |
| 1966.0 | 2.451 |
| 1967.0 | 2.458 |
| 1968.0 | 2.464 |
| 1969.0 | 2.47 |
| 1970.0 | 2.477 |
| 1971.0 | 2.485 |
| 1972.0 | 2.492 |
| 1973.0 | 2.498 |
| 1974.0 | 2.506 |
| 1975.0 | 2.512 |
| 1976.0 | 2.518 |
| 1977.0 | 2.526 |
| 1978.0 | 2.533 |
| 1979.0 | 2.538 |
| 1980.0 | 2.547 |
| 1981.0 | 2.552 |
| 1982.0 | 2.559 |
| 1983.0 | 2.565 |
| 1984.0 | 2.573 |
| 1985.0 | 2.579 |
| 1986.0 | 2.585 |
| 1987.0 | 2.593 |
| 1988.0 | 2.6 |
| 1989.0 | 2.605 |
| 1990.0 | 2.613 |
| 1991.0 | 2.62 |
| 1992.0 | 2.627 |
| 1993.0 | 2.632 |
| 1994.0 | 2.638 |
| 1995.0 | 2.646 |
| 1996.0 | 2.653 |
| 1997.0 | 2.659 |
| 1998.0 | 2.665 |
| 1999.0 | 2.671 |
| 2000.0 | 2.678 |
| 2001.0 | 2.684 |
| 2002.0 | 2.691 |
| 2003.0 | 2.698 |
| 2004.0 | 2.704 |
| 2005.0 | 2.71 |
| 2006.0 | 2.717 |
| 2007.0 | 2.723 |
| 2008.0 | 2.73 |
| 2009.0 | 2.736 |
| 2010.0 | 2.742 |
| 2011.0 | 2.749 |
| 2012.0 | 2.756 |
| 2013.0 | 2.762 |
| 2014.0 | 2.769 |
| 2015.0 | 2.776 |
| 2016.0 | 2.781 |
| 2017.0 | 2.788 |
| 2018.0 | 2.794 |
| 2019.0 | 2.802 |
| 2020.0 | 2.808 |
| 2021.0 | 2.814 |
| 2022.0 | 2.822 |
| 2023.0 | 2.827 |
| 2024.0 | 2.833 |
| 2025.0 | 2.838 |
| 2026.0 | 2.845 |
| 2027.0 | 2.851 |
| 2028.0 | 2.858 |
| 2029.0 | 2.864 |
| 2030.0 | 2.87 |
| 2031.0 | 2.876 |
| 2032.0 | 2.884 |
| 2033.0 | 2.89 |
| 2034.0 | 2.897 |
| 2035.0 | 2.903 |
| 2036.0 | 2.908 |
| 2037.0 | 2.914 |
| 2038.0 | 2.922 |
| 2039.0 | 2.927 |
| 2040.0 | 2.933 |
| 2041.0 | 2.939 |
| 2042.0 | 2.945 |
| 2043.0 | 2.952 |
| 2044.0 | 2.959 |
| 2045.0 | 2.964 |
| 2046.0 | 2.971 |
| 2047.0 | 2.977 |
| 2048.0 | 2.983 |
| 2049.0 | 2.989 |
| 2050.0 | 2.994 |
| 2051.0 | 3.001 |
| 2052.0 | 3.007 |
| 2053.0 | 3.012 |
| 2054.0 | 3.019 |
| 2055.0 | 3.025 |
| 2056.0 | 3.031 |
| 2057.0 | 3.037 |
| 2058.0 | 3.043 |
| 2059.0 | 3.05 |
| 2060.0 | 3.055 |
| 2061.0 | 3.063 |
| 2062.0 | 3.067 |
| 2063.0 | 3.073 |
| 2064.0 | 3.08 |
| 2065.0 | 3.086 |
| 2066.0 | 3.092 |
| 2067.0 | 3.096 |
| 2068.0 | 3.104 |
| 2069.0 | 3.109 |
| 2070.0 | 3.116 |
| 2071.0 | 3.122 |
| 2072.0 | 3.128 |
| 2073.0 | 3.133 |
| 2074.0 | 3.14 |
| 2075.0 | 3.146 |
| 2076.0 | 3.151 |
| 2077.0 | 3.158 |
| 2078.0 | 3.162 |
| 2079.0 | 3.17 |
| 2080.0 | 3.175 |
| 2081.0 | 3.179 |
| 2082.0 | 3.186 |
| 2083.0 | 3.192 |
| 2084.0 | 3.199 |
| 2085.0 | 3.203 |
| 2086.0 | 3.21 |
| 2087.0 | 3.215 |
| 2088.0 | 3.221 |
| 2089.0 | 3.228 |
| 2090.0 | 3.233 |
| 2091.0 | 3.238 |
| 2092.0 | 3.244 |
| 2093.0 | 3.25 |
| 2094.0 | 3.255 |
| 2095.0 | 3.26 |
| 2096.0 | 3.267 |
| 2097.0 | 3.273 |
| 2098.0 | 3.278 |
| 2099.0 | 3.284 |
| 2100.0 | 3.289 |
| 2101.0 | 3.294 |
| 2102.0 | 3.301 |
| 2103.0 | 3.305 |
| 2104.0 | 3.311 |
| 2105.0 | 3.316 |
| 2106.0 | 3.322 |
| 2107.0 | 3.328 |
| 2108.0 | 3.335 |
| 2109.0 | 3.34 |
| 2110.0 | 3.346 |
| 2111.0 | 3.352 |
| 2112.0 | 3.356 |
| 2113.0 | 3.362 |
| 2114.0 | 3.366 |
| 2115.0 | 3.372 |
| 2116.0 | 3.379 |
| 2117.0 | 3.383 |
| 2118.0 | 3.388 |
| 2119.0 | 3.394 |
| 2120.0 | 3.4 |
| 2121.0 | 3.406 |
| 2122.0 | 3.411 |
| 2123.0 | 3.416 |
| 2124.0 | 3.422 |
| 2125.0 | 3.427 |
| 2126.0 | 3.433 |
| 2127.0 | 3.439 |
| 2128.0 | 3.444 |
| 2129.0 | 3.447 |
| 2130.0 | 3.454 |
| 2131.0 | 3.459 |
| 2132.0 | 3.465 |
| 2133.0 | 3.471 |
| 2134.0 | 3.474 |
| 2135.0 | 3.481 |
| 2136.0 | 3.486 |
| 2137.0 | 3.492 |
| 2138.0 | 3.497 |
| 2139.0 | 3.502 |
| 2140.0 | 3.508 |
| 2141.0 | 3.513 |
| 2142.0 | 3.517 |
| 2143.0 | 3.523 |
| 2144.0 | 3.527 |
| 2145.0 | 3.532 |
| 2146.0 | 3.539 |
| 2147.0 | 3.544 |
| 2148.0 | 3.548 |
| 2149.0 | 3.555 |
| 2150.0 | 3.56 |
| 2151.0 | 3.565 |
| 2152.0 | 3.57 |
| 2153.0 | 3.575 |
| 2154.0 | 3.58 |
| 2155.0 | 3.584 |
| 2156.0 | 3.59 |
| 2157.0 | 3.595 |
| 2158.0 | 3.601 |
| 2159.0 | 3.606 |
| 2160.0 | 3.611 |
| 2161.0 | 3.615 |
| 2162.0 | 3.62 |
| 2163.0 | 3.625 |
| 2164.0 | 3.632 |
| 2165.0 | 3.636 |
| 2166.0 | 3.642 |
| 2167.0 | 3.646 |
| 2168.0 | 3.651 |
| 2169.0 | 3.657 |
| 2170.0 | 3.661 |
| 2171.0 | 3.666 |
| 2172.0 | 3.672 |
| 2173.0 | 3.676 |
| 2174.0 | 3.683 |
| 2175.0 | 3.687 |
| 2176.0 | 3.692 |
| 2177.0 | 3.696 |
| 2178.0 | 3.701 |
| 2179.0 | 3.706 |
| 2180.0 | 3.71 |
| 2181.0 | 3.715 |
| 2182.0 | 3.719 |
| 2183.0 | 3.724 |
| 2184.0 | 3.728 |
| 2185.0 | 3.731 |
| 2186.0 | 3.735 |
| 2187.0 | 3.741 |
| 2188.0 | 3.744 |
| 2189.0 | 3.749 |
| 2190.0 | 3.753 |
| 2191.0 | 3.757 |
| 2192.0 | 3.763 |
| 2193.0 | 3.765 |
| 2194.0 | 3.771 |
| 2195.0 | 3.774 |
| 2196.0 | 3.777 |
| 2197.0 | 3.781 |
| 2198.0 | 3.785 |
| 2199.0 | 3.791 |
| 2200.0 | 3.796 |